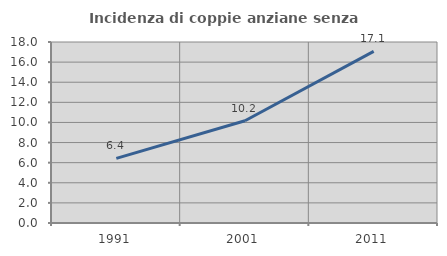
| Category | Incidenza di coppie anziane senza figli  |
|---|---|
| 1991.0 | 6.423 |
| 2001.0 | 10.168 |
| 2011.0 | 17.072 |